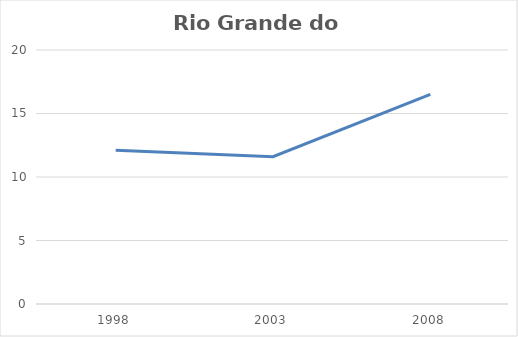
| Category | Rio Grande do Norte |
|---|---|
| 1998.0 | 12.1 |
| 2003.0 | 11.6 |
| 2008.0 | 16.5 |